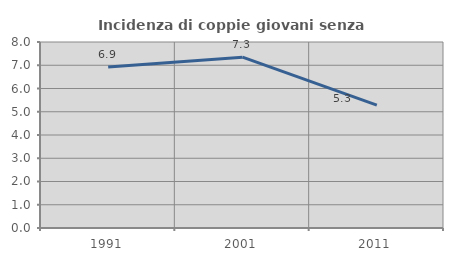
| Category | Incidenza di coppie giovani senza figli |
|---|---|
| 1991.0 | 6.923 |
| 2001.0 | 7.347 |
| 2011.0 | 5.285 |